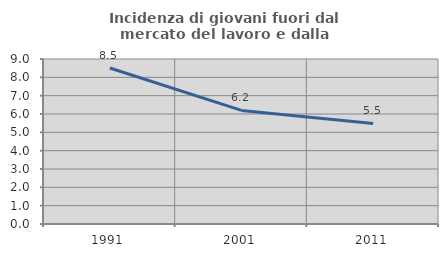
| Category | Incidenza di giovani fuori dal mercato del lavoro e dalla formazione  |
|---|---|
| 1991.0 | 8.511 |
| 2001.0 | 6.196 |
| 2011.0 | 5.483 |